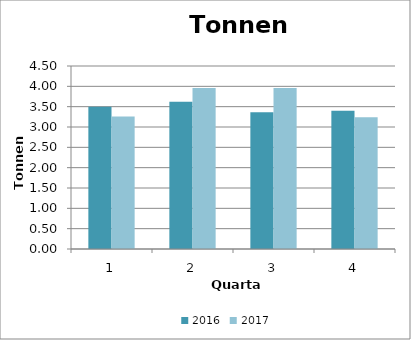
| Category | 2016 | 2017 |
|---|---|---|
| 0 | 3.5 | 3.26 |
| 1 | 3.62 | 3.96 |
| 2 | 3.36 | 3.96 |
| 3 | 3.4 | 3.24 |